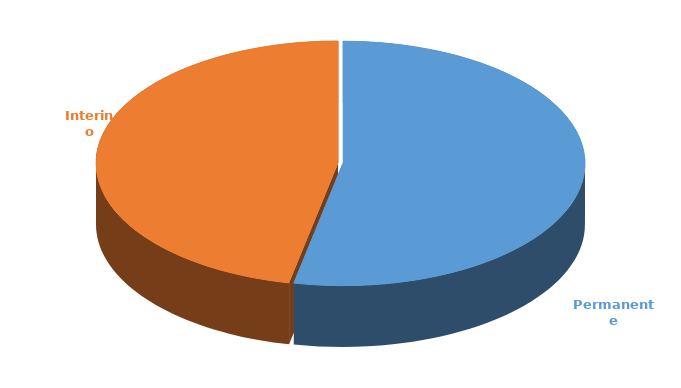
| Category | Cantidad |
|---|---|
| Permanente | 3118 |
| Interino | 2738 |